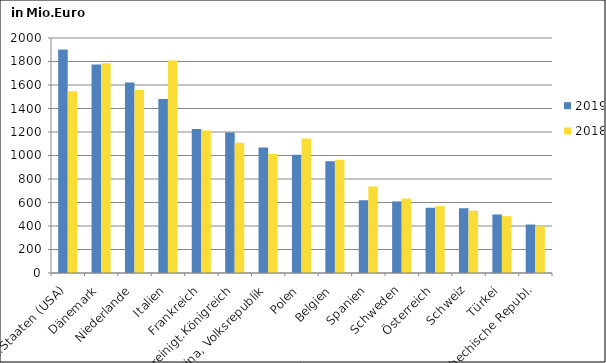
| Category | 2019 | 2018 |
|---|---|---|
| Verein.Staaten (USA) | 1902.893 | 1546.257 |
| Dänemark | 1773.91 | 1785.459 |
| Niederlande | 1621.59 | 1557.213 |
| Italien | 1480.659 | 1808.563 |
| Frankreich | 1226.59 | 1212.095 |
| Vereinigt.Königreich | 1194.891 | 1107.95 |
| China, Volksrepublik | 1068.472 | 1011.888 |
| Polen | 1006.036 | 1144.045 |
| Belgien | 952.022 | 962.909 |
| Spanien | 619.037 | 735.948 |
| Schweden | 609.028 | 632.915 |
| Österreich | 555.416 | 568.425 |
| Schweiz | 551.377 | 529.86 |
| Türkei | 497.971 | 483.51 |
| Tschechische Republ. | 412.59 | 398.114 |